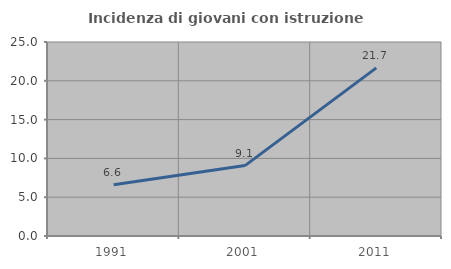
| Category | Incidenza di giovani con istruzione universitaria |
|---|---|
| 1991.0 | 6.597 |
| 2001.0 | 9.074 |
| 2011.0 | 21.663 |